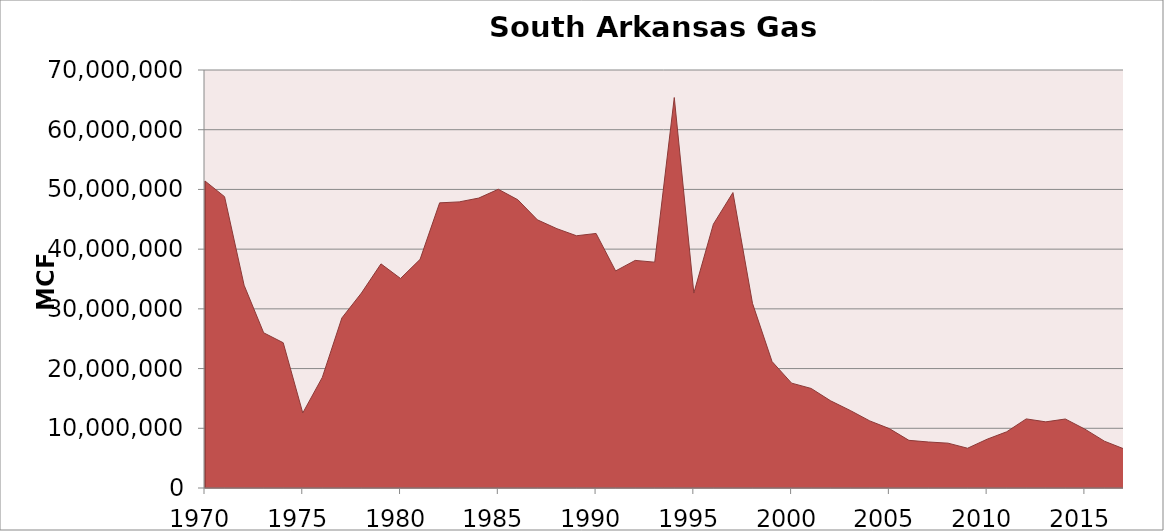
| Category | South Arkansas Gas Production |
|---|---|
| 1970.0 | 51412855 |
| 1971.0 | 48785555 |
| 1972.0 | 33958148 |
| 1973.0 | 25993767 |
| 1974.0 | 24326335 |
| 1975.0 | 12563601 |
| 1976.0 | 18523551 |
| 1977.0 | 28475700 |
| 1978.0 | 32649564 |
| 1979.0 | 37534134 |
| 1980.0 | 35089722 |
| 1981.0 | 38289303 |
| 1982.0 | 47751070 |
| 1983.0 | 47914955 |
| 1984.0 | 48553857 |
| 1985.0 | 50028719 |
| 1986.0 | 48267101 |
| 1987.0 | 44907042 |
| 1988.0 | 43423330 |
| 1989.0 | 42242603 |
| 1990.0 | 42629173 |
| 1991.0 | 36348918 |
| 1992.0 | 38111206 |
| 1993.0 | 37815669 |
| 1994.0 | 65386926 |
| 1995.0 | 32640427 |
| 1996.0 | 44184468 |
| 1997.0 | 49473807 |
| 1998.0 | 30923352 |
| 1999.0 | 21182409 |
| 2000.0 | 17562791 |
| 2001.0 | 16672211 |
| 2002.0 | 14594289 |
| 2003.0 | 12981953 |
| 2004.0 | 11234348 |
| 2005.0 | 9945131 |
| 2006.0 | 7981417 |
| 2007.0 | 7705905 |
| 2008.0 | 7508251 |
| 2009.0 | 6659527 |
| 2010.0 | 8172299 |
| 2011.0 | 9412080 |
| 2012.0 | 11571003 |
| 2013.0 | 11076490 |
| 2014.0 | 11552414 |
| 2015.0 | 9857782 |
| 2016.0 | 7838112 |
| 2017.0 | 6546451 |